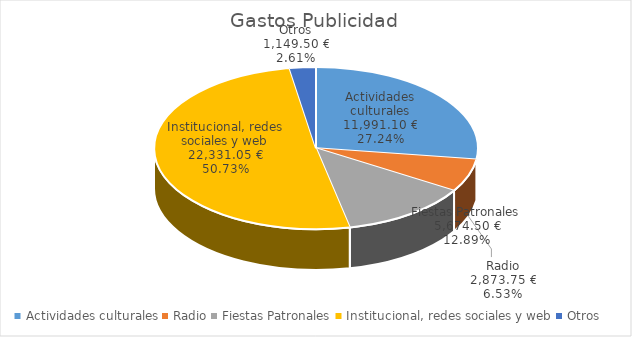
| Category | Series 0 | Series 1 |
|---|---|---|
| Actividades culturales | 11991.1 | 0.272 |
| Radio | 2873.75 | 0.065 |
| Fiestas Patronales | 5674.5 | 0.129 |
| Institucional, redes sociales y web | 22331.05 | 0.507 |
| Otros | 1149.5 | 0.026 |